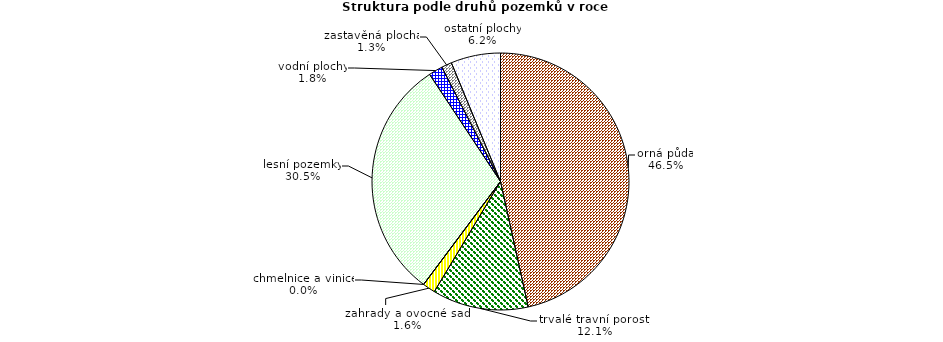
| Category | Struktura druhů pozemků |
|---|---|
| orná půda | 316251 |
| trvalé travní porosty | 82069 |
| zahrady a ovocné sady | 10835 |
| chmelnice a vinice | 6 |
| lesní pozemky | 207160 |
| vodní plochy | 12010 |
| zastavěná plocha | 8790 |
| ostatní plochy | 42447 |